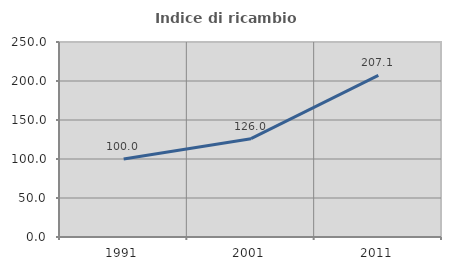
| Category | Indice di ricambio occupazionale  |
|---|---|
| 1991.0 | 100 |
| 2001.0 | 126.027 |
| 2011.0 | 207.107 |